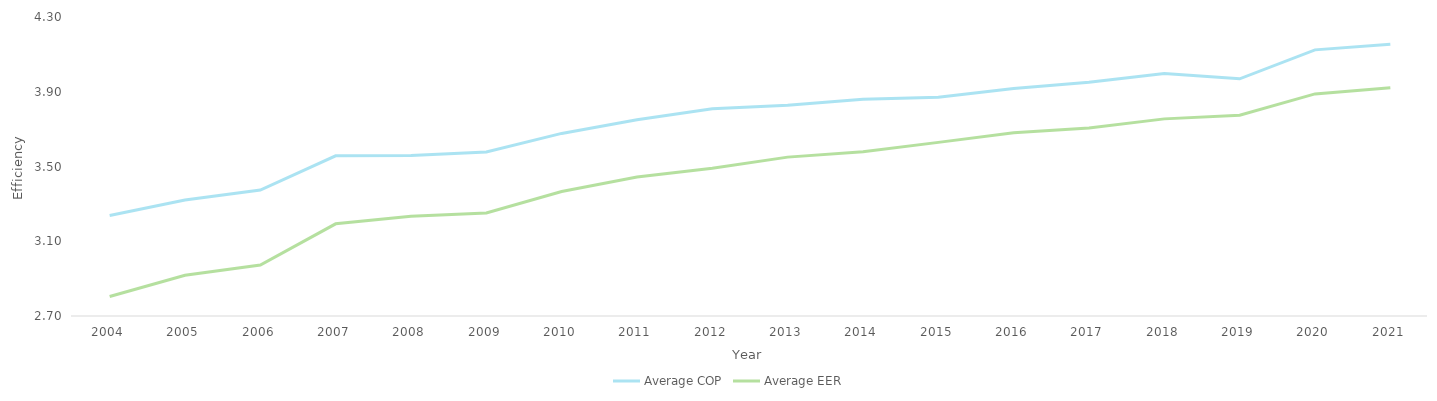
| Category | Average COP | Average EER |
|---|---|---|
| 2004.0 | 3.238 | 2.804 |
| 2005.0 | 3.321 | 2.918 |
| 2006.0 | 3.374 | 2.973 |
| 2007.0 | 3.557 | 3.193 |
| 2008.0 | 3.559 | 3.233 |
| 2009.0 | 3.578 | 3.252 |
| 2010.0 | 3.677 | 3.366 |
| 2011.0 | 3.751 | 3.444 |
| 2012.0 | 3.809 | 3.491 |
| 2013.0 | 3.828 | 3.55 |
| 2014.0 | 3.86 | 3.579 |
| 2015.0 | 3.871 | 3.629 |
| 2016.0 | 3.918 | 3.681 |
| 2017.0 | 3.951 | 3.706 |
| 2018.0 | 3.998 | 3.755 |
| 2019.0 | 3.969 | 3.774 |
| 2020.0 | 4.124 | 3.888 |
| 2021.0 | 4.154 | 3.922 |